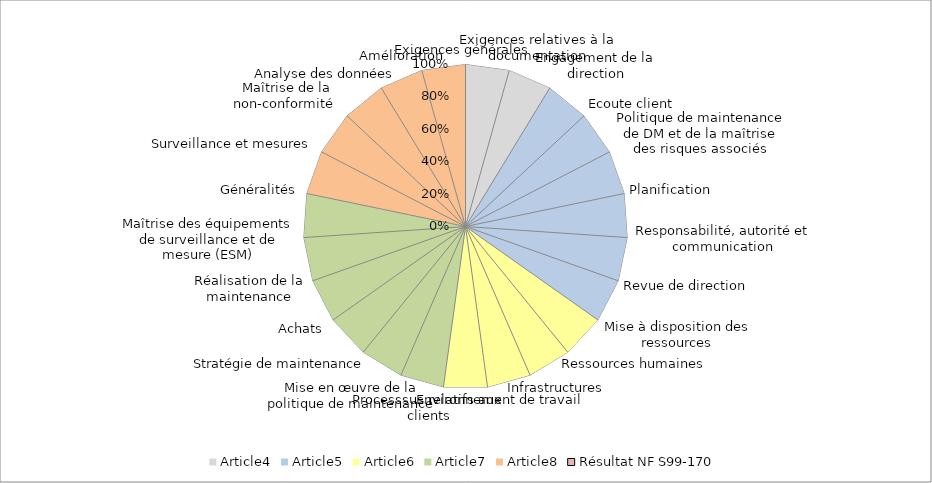
| Category | Article4 | Article5 | Article6 | Article7 | Article8 | Résultat NF S99-170 |
|---|---|---|---|---|---|---|
| 0 | 1 | 0 | 0 | 0 | 1 | 0 |
| 1 | 1 | 0 | 0 | 0 | 0 | 0 |
| 2 | 1 | 1 | 0 | 0 | 0 | 0 |
| 3 | 0 | 1 | 0 | 0 | 0 | 0 |
| 4 | 0 | 1 | 0 | 0 | 0 | 0 |
| 5 | 0 | 1 | 0 | 0 | 0 | 0 |
| 6 | 0 | 1 | 0 | 0 | 0 | 0 |
| 7 | 0 | 1 | 0 | 0 | 0 | 0 |
| 8 | 0 | 1 | 1 | 0 | 0 | 0 |
| 9 | 0 | 0 | 1 | 0 | 0 | 0 |
| 10 | 0 | 0 | 1 | 0 | 0 | 0 |
| 11 | 0 | 0 | 1 | 0 | 0 | 0 |
| 12 | 0 | 0 | 1 | 1 | 0 | 0 |
| 13 | 0 | 0 | 0 | 1 | 0 | 0 |
| 14 | 0 | 0 | 0 | 1 | 0 | 0 |
| 15 | 0 | 0 | 0 | 1 | 0 | 0 |
| 16 | 0 | 0 | 0 | 1 | 0 | 0 |
| 17 | 0 | 0 | 0 | 1 | 0 | 0 |
| 18 | 0 | 0 | 0 | 1 | 1 | 0 |
| 19 | 0 | 0 | 0 | 0 | 1 | 0 |
| 20 | 0 | 0 | 0 | 0 | 1 | 0 |
| 21 | 0 | 0 | 0 | 0 | 1 | 0 |
| 22 | 0 | 0 | 0 | 0 | 1 | 0 |